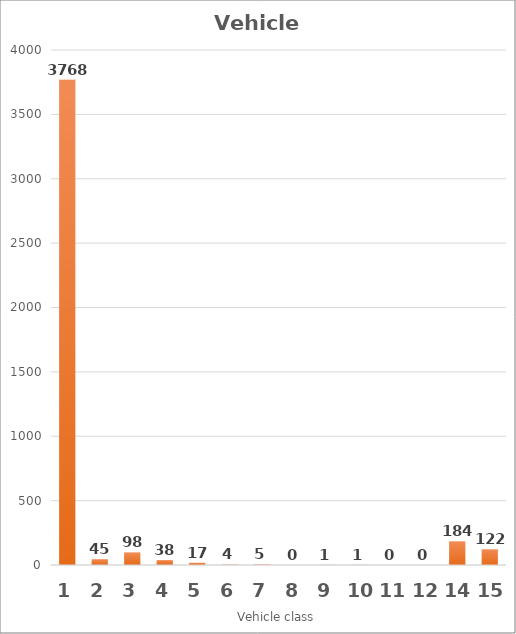
| Category | Series 0 |
|---|---|
| 1.0 | 3768 |
| 2.0 | 45 |
| 3.0 | 98 |
| 4.0 | 38 |
| 5.0 | 17 |
| 6.0 | 4 |
| 7.0 | 5 |
| 8.0 | 0 |
| 9.0 | 1 |
| 10.0 | 1 |
| 11.0 | 0 |
| 12.0 | 0 |
| 14.0 | 184 |
| 15.0 | 122 |